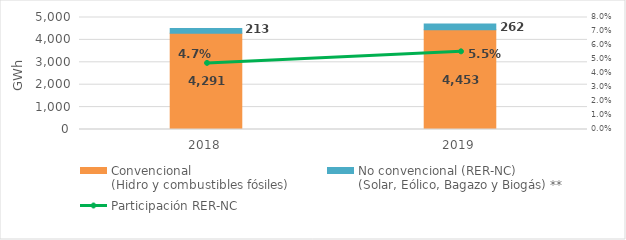
| Category | Convencional
(Hidro y combustibles fósiles) | No convencional (RER-NC)
(Solar, Eólico, Bagazo y Biogás) ** |
|---|---|---|
| 2018.0 | 4291.481 | 212.646 |
| 2019.0 | 4453.33 | 261.537 |